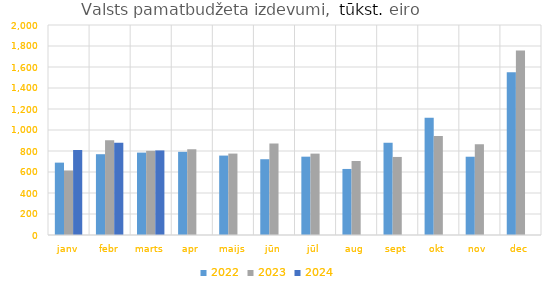
| Category | 2022 | 2023 | 2024 |
|---|---|---|---|
| janv | 689237.965 | 614585.632 | 809894.408 |
| febr | 769410.975 | 903091.852 | 879752.527 |
| marts | 784728.56 | 801670.588 | 805671.926 |
| apr | 792151.693 | 815830.901 | 0 |
| maijs | 756370.204 | 775435.197 | 0 |
| jūn | 721608.297 | 872192.844 | 0 |
| jūl | 745948.556 | 775102.307 | 0 |
| aug | 628998.795 | 704584.156 | 0 |
| sept | 879428.128 | 743373.689 | 0 |
| okt | 1117520.592 | 943256.707 | 0 |
| nov | 745480.917 | 864698.939 | 0 |
| dec | 1550280.295 | 1757604.888 | 0 |